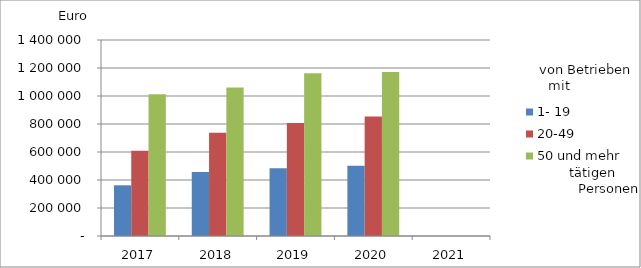
| Category | 1- 19 | 20-49 | 50 und mehr |
|---|---|---|---|
| 2017.0 | 362148.834 | 608159.206 | 1012092.607 |
| 2018.0 | 457961.358 | 737580.151 | 1061014.859 |
| 2019.0 | 483675.502 | 806796.943 | 1161609.68 |
| 2020.0 | 502090.993 | 853998.572 | 1171185.263 |
| 2021.0 | 0 | 0 | 0 |